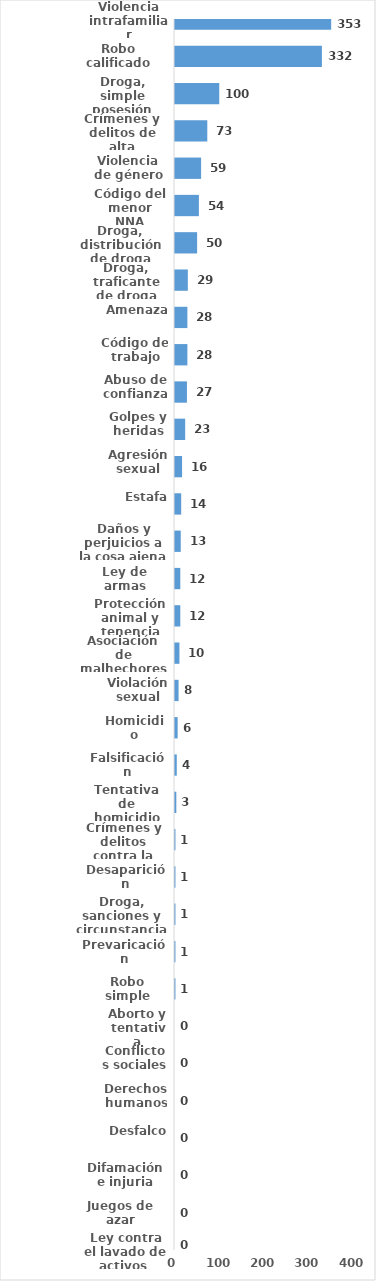
| Category | Series 0 |
|---|---|
| Violencia intrafamiliar | 353 |
| Robo calificado | 332 |
| Droga, simple posesión | 100 |
| Crímenes y delitos de alta tecnología | 73 |
| Violencia de género | 59 |
| Código del menor NNA | 54 |
| Droga, distribución de droga | 50 |
| Droga, traficante de droga | 29 |
| Amenaza | 28 |
| Código de trabajo | 28 |
| Abuso de confianza | 27 |
| Golpes y heridas | 23 |
| Agresión sexual | 16 |
| Estafa | 14 |
| Daños y perjuicios a la cosa ajena | 13 |
| Ley de armas | 12 |
| Protección animal y tenencia responsible | 12 |
| Asociación de malhechores | 10 |
| Violación sexual | 8 |
| Homicidio | 6 |
| Falsificación | 4 |
| Tentativa de homicidio | 3 |
| Crímenes y delitos contra la propiedad | 1 |
| Desaparición | 1 |
| Droga, sanciones y circunstancias agravantes | 1 |
| Prevaricación | 1 |
| Robo simple | 1 |
| Aborto y tentativa | 0 |
| Conflictos sociales | 0 |
| Derechos humanos | 0 |
| Desfalco | 0 |
| Difamación e injuria | 0 |
| Juegos de azar | 0 |
| Ley contra el lavado de activos  | 0 |